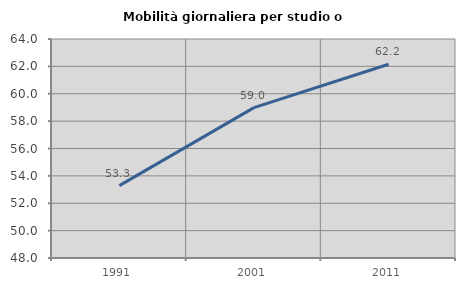
| Category | Mobilità giornaliera per studio o lavoro |
|---|---|
| 1991.0 | 53.291 |
| 2001.0 | 58.986 |
| 2011.0 | 62.158 |